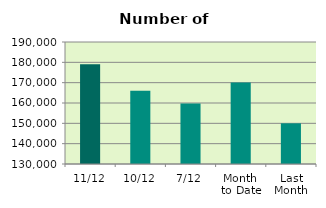
| Category | Series 0 |
|---|---|
| 11/12 | 178996 |
| 10/12 | 166072 |
| 7/12 | 159752 |
| Month 
to Date | 170120.857 |
| Last
Month | 150008.364 |